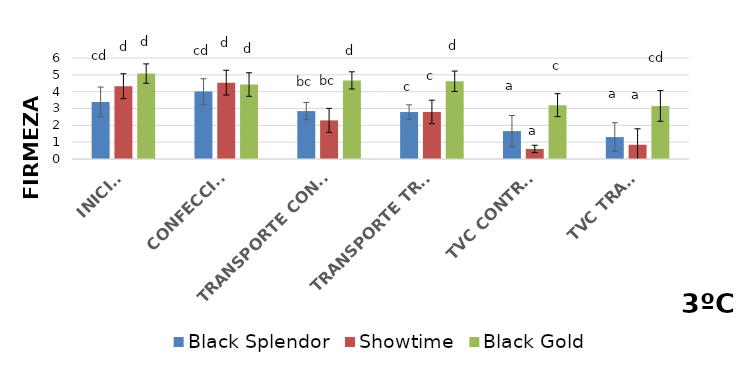
| Category | Black Splendor | Showtime | Black Gold |
|---|---|---|---|
| INICIAL | 3.39 | 4.325 | 5.075 |
| CONFECCIÓN | 4.007 | 4.535 | 4.425 |
|  TRANSPORTE CONTROL | 2.846 | 2.294 | 4.669 |
| TRANSPORTE TRAT. | 2.79 | 2.794 | 4.617 |
| TVC CONTROL | 1.657 | 0.597 | 3.199 |
| TVC TRAT. | 1.301 | 0.847 | 3.154 |